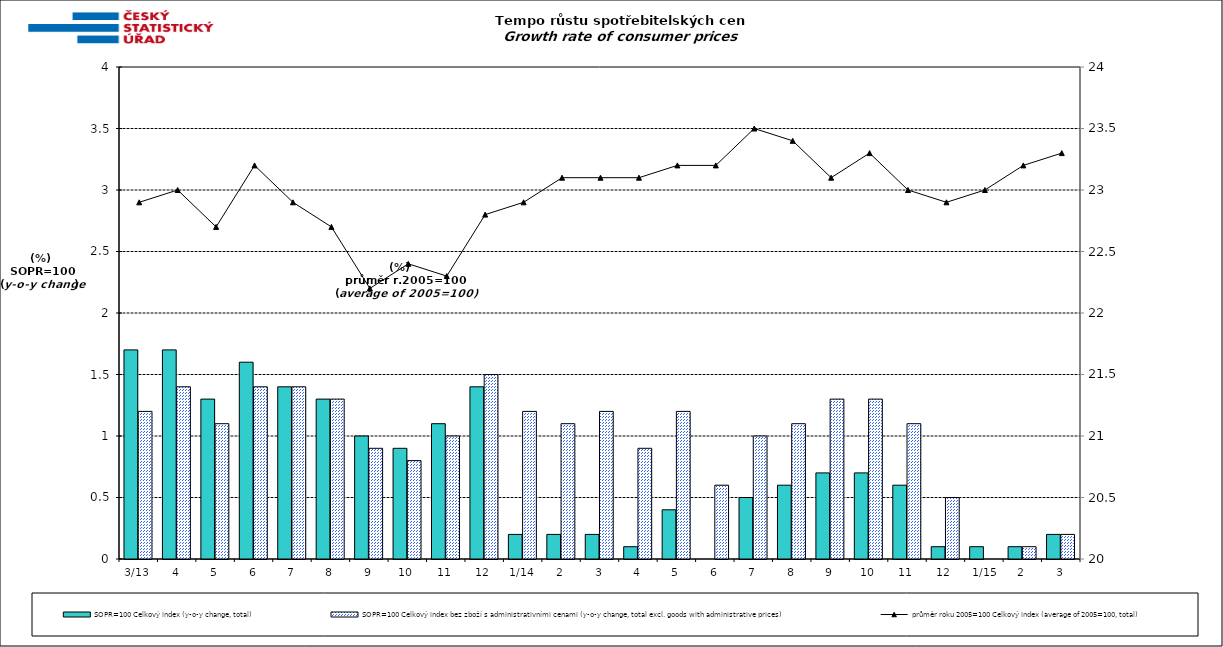
| Category | SOPR=100 Celkový index (y-o-y change, total) | SOPR=100 Celkový index bez zboží s administrativními cenami (y-o-y change, total excl. goods with administrative prices)  |
|---|---|---|
| 3/13 | 1.7 | 1.2 |
| 4 | 1.7 | 1.4 |
| 5 | 1.3 | 1.1 |
| 6 | 1.6 | 1.4 |
| 7 | 1.4 | 1.4 |
| 8 | 1.3 | 1.3 |
| 9 | 1 | 0.9 |
| 10 | 0.9 | 0.8 |
| 11 | 1.1 | 1 |
| 12 | 1.4 | 1.5 |
| 1/14 | 0.2 | 1.2 |
| 2 | 0.2 | 1.1 |
| 3 | 0.2 | 1.2 |
| 4 | 0.1 | 0.9 |
| 5 | 0.4 | 1.2 |
| 6 | 0 | 0.6 |
| 7 | 0.5 | 1 |
| 8 | 0.6 | 1.1 |
| 9 | 0.7 | 1.3 |
| 10 | 0.7 | 1.3 |
| 11 | 0.6 | 1.1 |
| 12 | 0.1 | 0.5 |
|  1/15 | 0.1 | 0 |
| 2 | 0.1 | 0.1 |
| 3 | 0.2 | 0.2 |